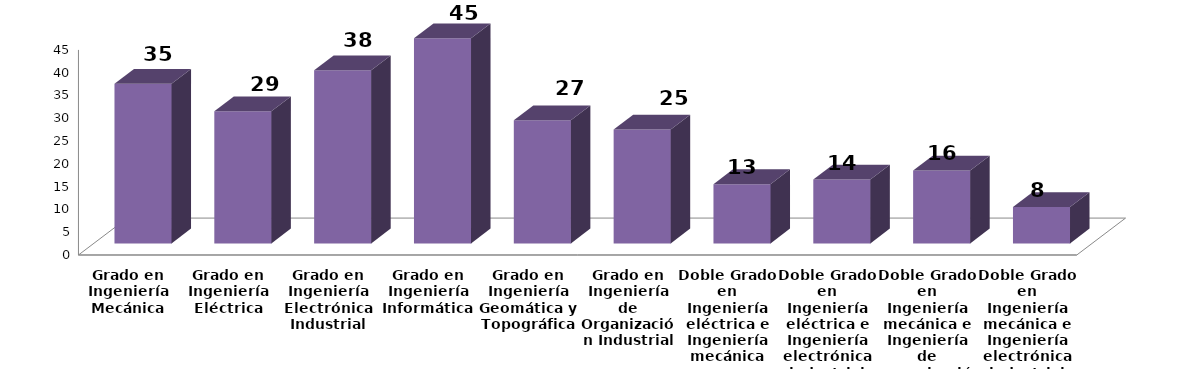
| Category | Series 0 |
|---|---|
| Grado en Ingeniería Mecánica | 35 |
| Grado en Ingeniería Eléctrica | 29 |
| Grado en Ingeniería Electrónica Industrial | 38 |
| Grado en Ingeniería Informática | 45 |
| Grado en Ingeniería Geomática y Topográfica | 27 |
| Grado en Ingeniería de Organización Industrial | 25 |
| Doble Grado en Ingeniería eléctrica e Ingeniería mecánica | 13 |
| Doble Grado en Ingeniería eléctrica e Ingeniería electrónica industrial | 14 |
| Doble Grado en Ingeniería mecánica e Ingeniería de organización industrial | 16 |
| Doble Grado en Ingeniería mecánica e Ingeniería electrónica industrial | 8 |